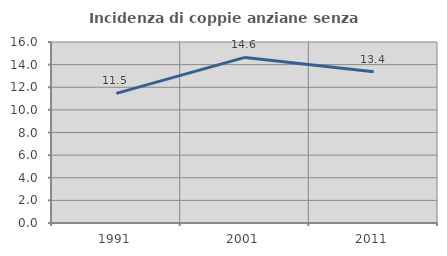
| Category | Incidenza di coppie anziane senza figli  |
|---|---|
| 1991.0 | 11.461 |
| 2001.0 | 14.639 |
| 2011.0 | 13.374 |